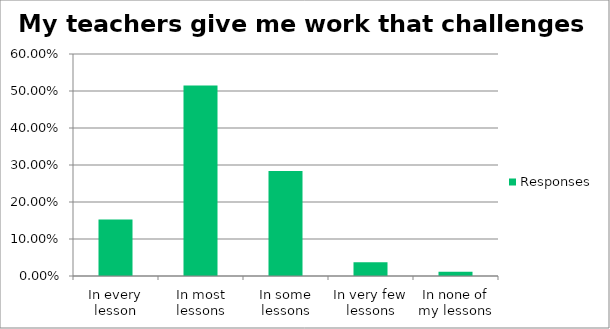
| Category | Responses |
|---|---|
| In every lesson | 0.153 |
| In most lessons | 0.515 |
| In some lessons | 0.284 |
| In very few lessons | 0.037 |
| In none of my lessons | 0.011 |